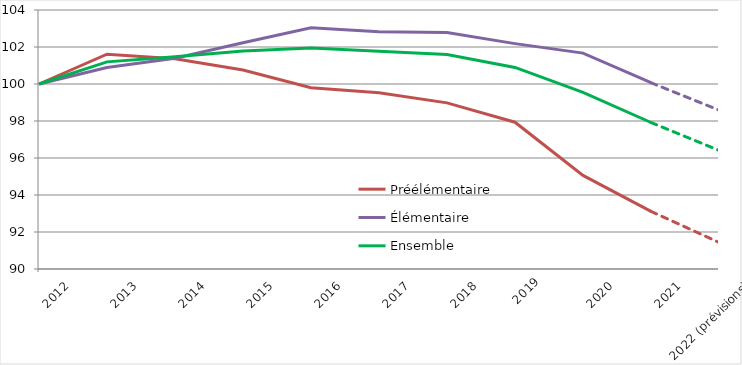
| Category | Préélémentaire | Élémentaire | Ensemble |
|---|---|---|---|
| 2012 | 100 | 100 | 100 |
| 2013 | 101.613 | 100.887 | 101.197 |
| 2014 | 101.361 | 101.395 | 101.469 |
| 2015 | 100.76 | 102.23 | 101.777 |
| 2016 | 99.794 | 103.04 | 101.952 |
| 2017 | 99.525 | 102.82 | 101.766 |
| 2018 | 98.981 | 102.779 | 101.589 |
| 2019
 | 97.935 | 102.183 | 100.895 |
| 2020 | 95.058 | 101.669 | 99.548 |
| 2021 | 93.114 | 100.068 | 97.919 |
| 2022 (prévisions) | 91.438 | 98.588 | 96.412 |